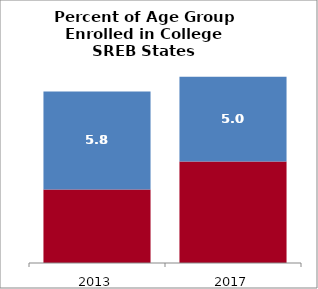
| Category | 18 to 24 | 25 to 49 |
|---|---|---|
| 2013.0 | 34.365 | 5.828 |
| 2017.0 | 36.03 | 5.033 |